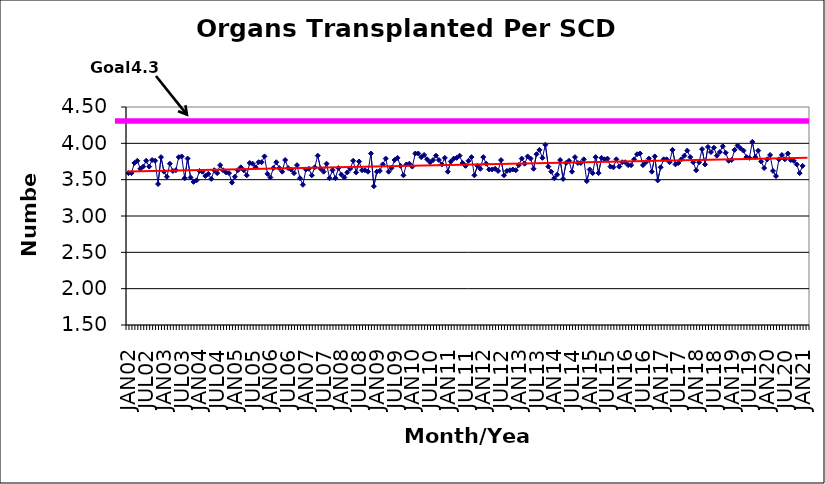
| Category | Series 0 |
|---|---|
| JAN02 | 3.59 |
| FEB02 | 3.59 |
| MAR02 | 3.73 |
| APR02 | 3.76 |
| MAY02 | 3.65 |
| JUN02 | 3.68 |
| JUL02 | 3.76 |
| AUG02 | 3.68 |
| SEP02 | 3.77 |
| OCT02 | 3.76 |
| NOV02 | 3.44 |
| DEC02 | 3.81 |
| JAN03 | 3.61 |
| FEB03 | 3.54 |
| MAR03 | 3.72 |
| APR03 | 3.62 |
| MAY03 | 3.63 |
| JUN03 | 3.81 |
| JUL03 | 3.82 |
| AUG03 | 3.52 |
| SEP03 | 3.79 |
| OCT03 | 3.53 |
| NOV03 | 3.47 |
| DEC03 | 3.49 |
| JAN04 | 3.62 |
| FEB04 | 3.61 |
| MAR04 | 3.55 |
| APR04 | 3.58 |
| MAY04 | 3.51 |
| JUN04 | 3.63 |
| JUL04 | 3.59 |
| AUG04 | 3.7 |
| SEP04 | 3.63 |
| OCT04 | 3.6 |
| NOV04 | 3.59 |
| DEC04 | 3.46 |
| JAN05 | 3.54 |
| FEB05 | 3.63 |
| MAR05 | 3.67 |
| APR05 | 3.63 |
| MAY05 | 3.56 |
| JUN05 | 3.73 |
| JUL05 | 3.72 |
| AUG05 | 3.67 |
| SEP05 | 3.74 |
| OCT05 | 3.74 |
| NOV05 | 3.82 |
| DEC05 | 3.58 |
| JAN06 | 3.53 |
| FEB06 | 3.66 |
| MAR06 | 3.74 |
| APR06 | 3.66 |
| MAY06 | 3.61 |
| JUN06 | 3.77 |
| JUL06 | 3.66 |
| AUG06 | 3.64 |
| SEP06 | 3.59 |
| OCT06 | 3.7 |
| NOV06 | 3.52 |
| DEC06 | 3.43 |
| JAN07 | 3.64 |
| FEB07 | 3.65 |
| MAR07 | 3.56 |
| APR07 | 3.67 |
| MAY07 | 3.83 |
| JUN07 | 3.65 |
| JUL07 | 3.61 |
| AUG07 | 3.72 |
| SEP07 | 3.52 |
| OCT07 | 3.63 |
| NOV07 | 3.52 |
| DEC07 | 3.66 |
| JAN08 | 3.57 |
| FEB08 | 3.53 |
| MAR08 | 3.6 |
| APR08 | 3.65 |
| MAY08 | 3.76 |
| JUN08 | 3.6 |
| JUL08 | 3.75 |
| AUG08 | 3.63 |
| SEP08 | 3.63 |
| OCT08 | 3.61 |
| NOV08 | 3.86 |
| DEC08 | 3.41 |
| JAN09 | 3.61 |
| FEB09 | 3.62 |
| MAR09 | 3.71 |
| APR09 | 3.79 |
| MAY09 | 3.61 |
| JUN09 | 3.66 |
| JUL09 | 3.77 |
| AUG09 | 3.8 |
| SEP09 | 3.69 |
| OCT09 | 3.56 |
| NOV09 | 3.71 |
| DEC09 | 3.72 |
| JAN10 | 3.68 |
| FEB10 | 3.86 |
| MAR10 | 3.86 |
| APR10 | 3.81 |
| MAY10 | 3.84 |
| JUN10 | 3.78 |
| JUL10 | 3.74 |
| AUG10 | 3.77 |
| SEP10 | 3.83 |
| OCT10 | 3.77 |
| NOV10 | 3.71 |
| DEC10 | 3.8 |
| JAN11 | 3.61 |
| FEB11 | 3.75 |
| MAR11 | 3.79 |
| APR11 | 3.8 |
| MAY11 | 3.83 |
| JUN11 | 3.73 |
| JUL11 | 3.69 |
| AUG11 | 3.76 |
| SEP11 | 3.81 |
| OCT11 | 3.56 |
| NOV11 | 3.69 |
| DEC11 | 3.65 |
| JAN12 | 3.81 |
| FEB12 | 3.72 |
| MAR12 | 3.64 |
| APR12 | 3.64 |
| MAY12 | 3.65 |
| JUN12 | 3.62 |
| JUL12 | 3.77 |
| AUG12 | 3.56 |
| SEP12 | 3.62 |
| OCT12 | 3.63 |
| NOV12 | 3.64 |
| DEC12 | 3.63 |
| JAN13 | 3.7 |
| FEB13 | 3.79 |
| MAR13 | 3.72 |
| APR13 | 3.82 |
| MAY13 | 3.79 |
| JUN13 | 3.65 |
| JUL13 | 3.85 |
| AUG13 | 3.91 |
| SEP13 | 3.8 |
| OCT13 | 3.98 |
| NOV13 | 3.68 |
| DEC13 | 3.61 |
| JAN14 | 3.52 |
| FEB14 | 3.57 |
| MAR14 | 3.77 |
| APR14 | 3.51 |
| MAY14 | 3.73 |
| JUN14 | 3.76 |
| JUL14 | 3.61 |
| AUG14 | 3.81 |
| SEP14 | 3.73 |
| OCT14 | 3.73 |
| NOV14 | 3.78 |
| DEC14 | 3.48 |
| JAN15 | 3.64 |
| FEB15 | 3.59 |
| MAR15 | 3.81 |
| APR15 | 3.59 |
| MAY15 | 3.8 |
| JUN15 | 3.78 |
| JUL15 | 3.79 |
| AUG15 | 3.68 |
| SEP15 | 3.67 |
| OCT15 | 3.78 |
| NOV15 | 3.68 |
| DEC15 | 3.74 |
| JAN16 | 3.74 |
| FEB16 | 3.7 |
| MAR16 | 3.7 |
| APR16 | 3.78 |
| MAY16 | 3.85 |
| JUN16 | 3.86 |
| JUL16 | 3.7 |
| AUG16 | 3.74 |
| SEP16 | 3.79 |
| OCT16 | 3.61 |
| NOV16 | 3.82 |
| DEC16 | 3.49 |
| JAN17 | 3.67 |
| FEB17 | 3.78 |
| MAR17 | 3.78 |
| APR17 | 3.74 |
| MAY17 | 3.91 |
| JUN17 | 3.71 |
| JUL17 | 3.73 |
| AUG17 | 3.78 |
| SEP17 | 3.83 |
| OCT17 | 3.9 |
| NOV17 | 3.81 |
| DEC17 | 3.74 |
| JAN18 | 3.63 |
| FEB18 | 3.74 |
| MAR18 | 3.92 |
| APR18 | 3.71 |
| MAY18 | 3.95 |
| JUN18 | 3.88 |
| JUL18 | 3.94 |
| AUG18 | 3.83 |
| SEP18 | 3.88 |
| OCT18 | 3.96 |
| NOV18 | 3.87 |
| DEC18 | 3.76 |
| JAN19 | 3.77 |
| FEB19 | 3.91 |
| MAR19 | 3.97 |
| APR19 | 3.93 |
| MAY19 | 3.9 |
| JUN19 | 3.81 |
| JUL19 | 3.8 |
| AUG19 | 4.02 |
| SEP19 | 3.81 |
| OCT19 | 3.9 |
| NOV19 | 3.75 |
| DEC19 | 3.66 |
| JAN20 | 3.78 |
| FEB20 | 3.84 |
| MAR20 | 3.62 |
| APR20 | 3.55 |
| MAY20 | 3.78 |
| JUN20 | 3.84 |
| JUL20 | 3.78 |
| AUG20 | 3.86 |
| SEP20 | 3.77 |
| OCT20 | 3.76 |
| NOV20 | 3.71 |
| DEC20 | 3.59 |
| JAN21 | 3.69 |